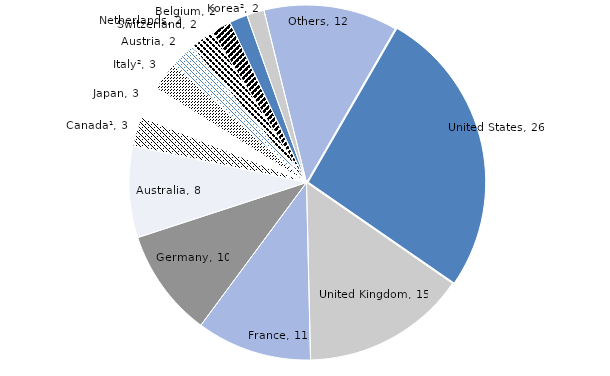
| Category | 2014 |
|---|---|
| United States | 26.296 |
| United Kingdom | 15.005 |
| France | 10.506 |
| Germany | 9.839 |
| Australia | 8.306 |
| Canada¹ | 2.715 |
| Japan | 2.916 |
| Italy² | 2.635 |
| Austria | 2.289 |
| Switzerland | 2.24 |
| Belgium | 1.814 |
| Netherlands | 1.663 |
| Korea² | 1.584 |
| Others | 12.191 |